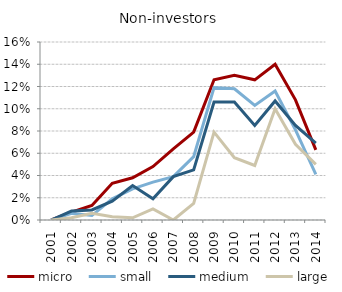
| Category | micro | small | medium | large |
|---|---|---|---|---|
| 2001.0 | 0 | 0 | 0 | 0 |
| 2002.0 | 0.007 | 0.006 | 0.008 | 0.002 |
| 2003.0 | 0.013 | 0.004 | 0.009 | 0.006 |
| 2004.0 | 0.033 | 0.019 | 0.017 | 0.003 |
| 2005.0 | 0.038 | 0.028 | 0.031 | 0.002 |
| 2006.0 | 0.048 | 0.034 | 0.019 | 0.01 |
| 2007.0 | 0.064 | 0.039 | 0.039 | 0 |
| 2008.0 | 0.079 | 0.057 | 0.045 | 0.015 |
| 2009.0 | 0.126 | 0.119 | 0.106 | 0.079 |
| 2010.0 | 0.13 | 0.118 | 0.106 | 0.056 |
| 2011.0 | 0.126 | 0.103 | 0.085 | 0.049 |
| 2012.0 | 0.14 | 0.116 | 0.107 | 0.1 |
| 2013.0 | 0.108 | 0.081 | 0.085 | 0.068 |
| 2014.0 | 0.063 | 0.041 | 0.069 | 0.05 |